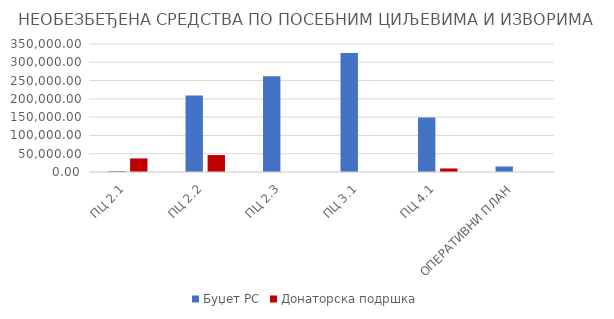
| Category | Буџет РС | Донаторска подршка |
|---|---|---|
| ПЦ 2.1 | 2680.25 | 37088.84 |
| ПЦ 2.2 | 209004 | 46374 |
| ПЦ 2.3 | 261710.656 | 0 |
| ПЦ 3.1 | 325100.766 | 0 |
| ПЦ 4.1 | 148684.76 | 9644.825 |
| ОПЕРАТИВНИ ПЛАН | 15042.48 | 0 |